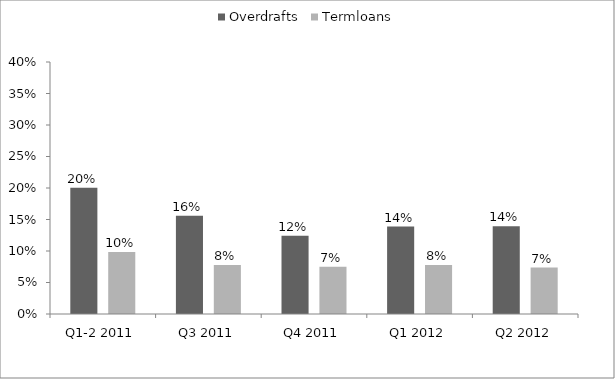
| Category | Overdrafts | Termloans |
|---|---|---|
| Q1-2 2011 | 0.2 | 0.099 |
| Q3 2011 | 0.156 | 0.078 |
| Q4 2011 | 0.124 | 0.075 |
| Q1 2012 | 0.139 | 0.078 |
| Q2 2012 | 0.139 | 0.074 |